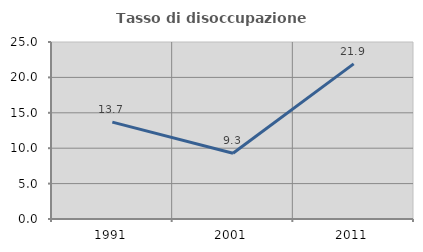
| Category | Tasso di disoccupazione giovanile  |
|---|---|
| 1991.0 | 13.686 |
| 2001.0 | 9.297 |
| 2011.0 | 21.91 |